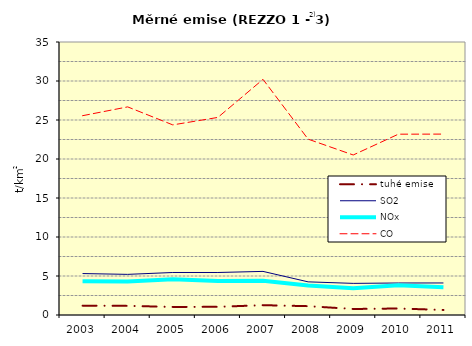
| Category | tuhé emise | SO2 | NOx | CO |
|---|---|---|---|---|
| 2003.0 | 1.198 | 5.314 | 4.338 | 25.551 |
| 2004.0 | 1.171 | 5.21 | 4.307 | 26.681 |
| 2005.0 | 1.036 | 5.451 | 4.585 | 24.373 |
| 2006.0 | 1.046 | 5.45 | 4.345 | 25.331 |
| 2007.0 | 1.26 | 5.59 | 4.378 | 30.21 |
| 2008.0 | 1.133 | 4.249 | 3.772 | 22.544 |
| 2009.0 | 0.772 | 4.053 | 3.437 | 20.515 |
| 2010.0 | 0.832 | 4.105 | 3.825 | 23.182 |
| 2011.0 | 0.646 | 4.107 | 3.542 | 23.192 |